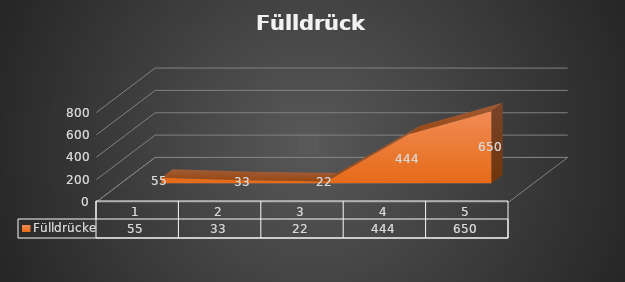
| Category | Fülldrücke |
|---|---|
| 0 | 55 |
| 1 | 33 |
| 2 | 22 |
| 3 | 444 |
| 4 | 650 |